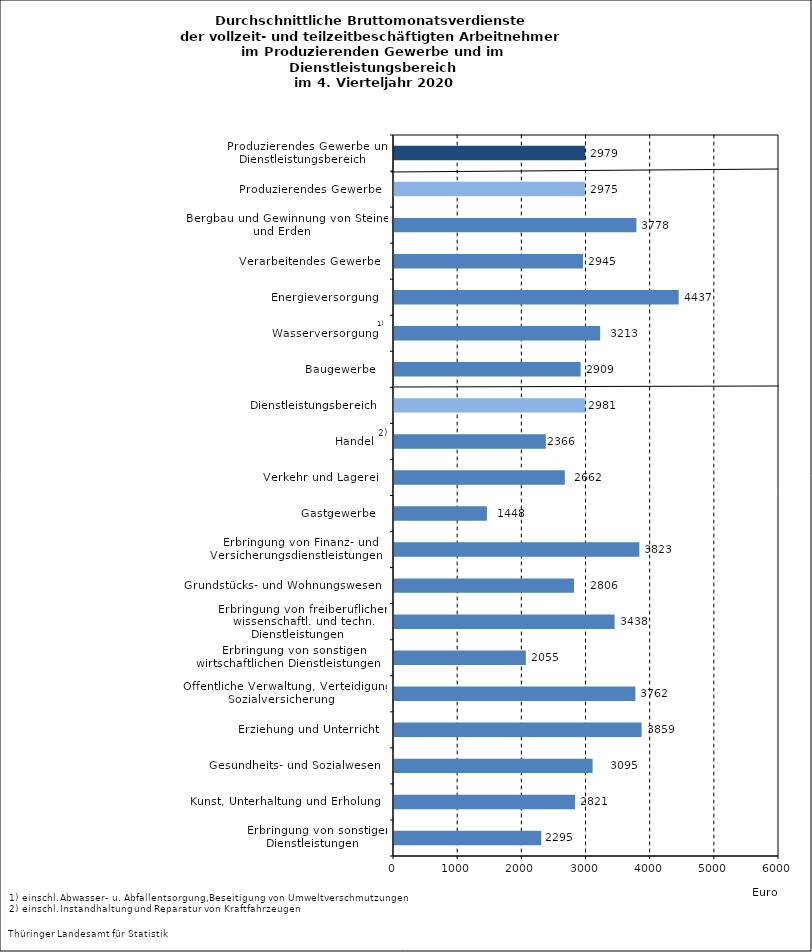
| Category | Series 0 |
|---|---|
| Erbringung von sonstigen Dienstleistungen    | 2295 |
| Kunst, Unterhaltung und Erholung    | 2821 |
| Gesundheits- und Sozialwesen    | 3095 |
| Erziehung und Unterricht    | 3859 |
| Öffentliche Verwaltung, Verteidigung, Sozialversicherung    | 3762 |
| Erbringung von sonstigen wirtschaftlichen Dienstleistungen    | 2055 |
| Erbringung von freiberuflichen, wissenschaftl. und techn. Dienstleistungen    | 3438 |
| Grundstücks- und Wohnungswesen    | 2806 |
| Erbringung von Finanz- und Versicherungsdienstleistungen    | 3823 |
| Gastgewerbe    | 1448 |
| Verkehr und Lagerei    | 2662 |
| Handel    | 2366 |
| Dienstleistungsbereich    | 2981 |
| Baugewerbe    | 2909 |
| Wasserversorgung    | 3213 |
| Energieversorgung    | 4437 |
| Verarbeitendes Gewerbe    | 2945 |
| Bergbau und Gewinnung von Steinen und Erden    | 3778 |
| Produzierendes Gewerbe    | 2975 |
| Produzierendes Gewerbe und Dienstleistungsbereich    | 2979 |